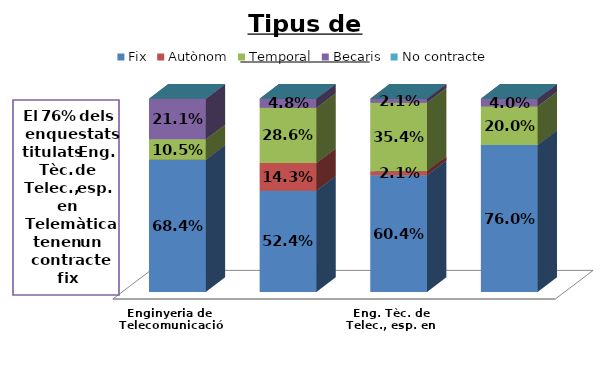
| Category | Fix | Autònom | Temporal | Becaris | No contracte |
|---|---|---|---|---|---|
| Enginyeria de Telecomunicació | 0.684 | 0 | 0.105 | 0.211 | 0 |
| Eng. Tèc. Aeronàutica, esp. en Aeronavegació | 0.524 | 0.143 | 0.286 | 0.048 | 0 |
| Eng. Tèc. de Telec., esp. en Sistemes de Telecomunicació | 0.604 | 0.021 | 0.354 | 0.021 | 0 |
| Eng. Tèc. de Telec., esp. en Telemàtica | 0.76 | 0 | 0.2 | 0.04 | 0 |